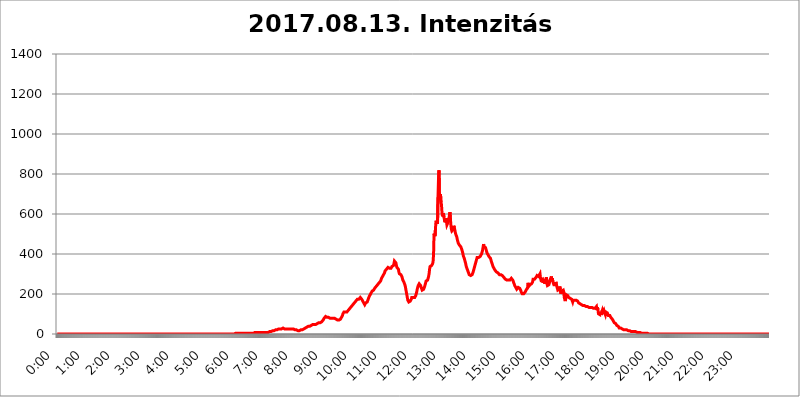
| Category | 2017.08.13. Intenzitás [W/m^2] |
|---|---|
| 0.0 | 0 |
| 0.0006944444444444445 | 0 |
| 0.001388888888888889 | 0 |
| 0.0020833333333333333 | 0 |
| 0.002777777777777778 | 0 |
| 0.003472222222222222 | 0 |
| 0.004166666666666667 | 0 |
| 0.004861111111111111 | 0 |
| 0.005555555555555556 | 0 |
| 0.0062499999999999995 | 0 |
| 0.006944444444444444 | 0 |
| 0.007638888888888889 | 0 |
| 0.008333333333333333 | 0 |
| 0.009027777777777779 | 0 |
| 0.009722222222222222 | 0 |
| 0.010416666666666666 | 0 |
| 0.011111111111111112 | 0 |
| 0.011805555555555555 | 0 |
| 0.012499999999999999 | 0 |
| 0.013194444444444444 | 0 |
| 0.013888888888888888 | 0 |
| 0.014583333333333332 | 0 |
| 0.015277777777777777 | 0 |
| 0.015972222222222224 | 0 |
| 0.016666666666666666 | 0 |
| 0.017361111111111112 | 0 |
| 0.018055555555555557 | 0 |
| 0.01875 | 0 |
| 0.019444444444444445 | 0 |
| 0.02013888888888889 | 0 |
| 0.020833333333333332 | 0 |
| 0.02152777777777778 | 0 |
| 0.022222222222222223 | 0 |
| 0.02291666666666667 | 0 |
| 0.02361111111111111 | 0 |
| 0.024305555555555556 | 0 |
| 0.024999999999999998 | 0 |
| 0.025694444444444447 | 0 |
| 0.02638888888888889 | 0 |
| 0.027083333333333334 | 0 |
| 0.027777777777777776 | 0 |
| 0.02847222222222222 | 0 |
| 0.029166666666666664 | 0 |
| 0.029861111111111113 | 0 |
| 0.030555555555555555 | 0 |
| 0.03125 | 0 |
| 0.03194444444444445 | 0 |
| 0.03263888888888889 | 0 |
| 0.03333333333333333 | 0 |
| 0.034027777777777775 | 0 |
| 0.034722222222222224 | 0 |
| 0.035416666666666666 | 0 |
| 0.036111111111111115 | 0 |
| 0.03680555555555556 | 0 |
| 0.0375 | 0 |
| 0.03819444444444444 | 0 |
| 0.03888888888888889 | 0 |
| 0.03958333333333333 | 0 |
| 0.04027777777777778 | 0 |
| 0.04097222222222222 | 0 |
| 0.041666666666666664 | 0 |
| 0.042361111111111106 | 0 |
| 0.04305555555555556 | 0 |
| 0.043750000000000004 | 0 |
| 0.044444444444444446 | 0 |
| 0.04513888888888889 | 0 |
| 0.04583333333333334 | 0 |
| 0.04652777777777778 | 0 |
| 0.04722222222222222 | 0 |
| 0.04791666666666666 | 0 |
| 0.04861111111111111 | 0 |
| 0.049305555555555554 | 0 |
| 0.049999999999999996 | 0 |
| 0.05069444444444445 | 0 |
| 0.051388888888888894 | 0 |
| 0.052083333333333336 | 0 |
| 0.05277777777777778 | 0 |
| 0.05347222222222222 | 0 |
| 0.05416666666666667 | 0 |
| 0.05486111111111111 | 0 |
| 0.05555555555555555 | 0 |
| 0.05625 | 0 |
| 0.05694444444444444 | 0 |
| 0.057638888888888885 | 0 |
| 0.05833333333333333 | 0 |
| 0.05902777777777778 | 0 |
| 0.059722222222222225 | 0 |
| 0.06041666666666667 | 0 |
| 0.061111111111111116 | 0 |
| 0.06180555555555556 | 0 |
| 0.0625 | 0 |
| 0.06319444444444444 | 0 |
| 0.06388888888888888 | 0 |
| 0.06458333333333334 | 0 |
| 0.06527777777777778 | 0 |
| 0.06597222222222222 | 0 |
| 0.06666666666666667 | 0 |
| 0.06736111111111111 | 0 |
| 0.06805555555555555 | 0 |
| 0.06874999999999999 | 0 |
| 0.06944444444444443 | 0 |
| 0.07013888888888889 | 0 |
| 0.07083333333333333 | 0 |
| 0.07152777777777779 | 0 |
| 0.07222222222222223 | 0 |
| 0.07291666666666667 | 0 |
| 0.07361111111111111 | 0 |
| 0.07430555555555556 | 0 |
| 0.075 | 0 |
| 0.07569444444444444 | 0 |
| 0.0763888888888889 | 0 |
| 0.07708333333333334 | 0 |
| 0.07777777777777778 | 0 |
| 0.07847222222222222 | 0 |
| 0.07916666666666666 | 0 |
| 0.0798611111111111 | 0 |
| 0.08055555555555556 | 0 |
| 0.08125 | 0 |
| 0.08194444444444444 | 0 |
| 0.08263888888888889 | 0 |
| 0.08333333333333333 | 0 |
| 0.08402777777777777 | 0 |
| 0.08472222222222221 | 0 |
| 0.08541666666666665 | 0 |
| 0.08611111111111112 | 0 |
| 0.08680555555555557 | 0 |
| 0.08750000000000001 | 0 |
| 0.08819444444444445 | 0 |
| 0.08888888888888889 | 0 |
| 0.08958333333333333 | 0 |
| 0.09027777777777778 | 0 |
| 0.09097222222222222 | 0 |
| 0.09166666666666667 | 0 |
| 0.09236111111111112 | 0 |
| 0.09305555555555556 | 0 |
| 0.09375 | 0 |
| 0.09444444444444444 | 0 |
| 0.09513888888888888 | 0 |
| 0.09583333333333333 | 0 |
| 0.09652777777777777 | 0 |
| 0.09722222222222222 | 0 |
| 0.09791666666666667 | 0 |
| 0.09861111111111111 | 0 |
| 0.09930555555555555 | 0 |
| 0.09999999999999999 | 0 |
| 0.10069444444444443 | 0 |
| 0.1013888888888889 | 0 |
| 0.10208333333333335 | 0 |
| 0.10277777777777779 | 0 |
| 0.10347222222222223 | 0 |
| 0.10416666666666667 | 0 |
| 0.10486111111111111 | 0 |
| 0.10555555555555556 | 0 |
| 0.10625 | 0 |
| 0.10694444444444444 | 0 |
| 0.1076388888888889 | 0 |
| 0.10833333333333334 | 0 |
| 0.10902777777777778 | 0 |
| 0.10972222222222222 | 0 |
| 0.1111111111111111 | 0 |
| 0.11180555555555556 | 0 |
| 0.11180555555555556 | 0 |
| 0.1125 | 0 |
| 0.11319444444444444 | 0 |
| 0.11388888888888889 | 0 |
| 0.11458333333333333 | 0 |
| 0.11527777777777777 | 0 |
| 0.11597222222222221 | 0 |
| 0.11666666666666665 | 0 |
| 0.1173611111111111 | 0 |
| 0.11805555555555557 | 0 |
| 0.11944444444444445 | 0 |
| 0.12013888888888889 | 0 |
| 0.12083333333333333 | 0 |
| 0.12152777777777778 | 0 |
| 0.12222222222222223 | 0 |
| 0.12291666666666667 | 0 |
| 0.12291666666666667 | 0 |
| 0.12361111111111112 | 0 |
| 0.12430555555555556 | 0 |
| 0.125 | 0 |
| 0.12569444444444444 | 0 |
| 0.12638888888888888 | 0 |
| 0.12708333333333333 | 0 |
| 0.16875 | 0 |
| 0.12847222222222224 | 0 |
| 0.12916666666666668 | 0 |
| 0.12986111111111112 | 0 |
| 0.13055555555555556 | 0 |
| 0.13125 | 0 |
| 0.13194444444444445 | 0 |
| 0.1326388888888889 | 0 |
| 0.13333333333333333 | 0 |
| 0.13402777777777777 | 0 |
| 0.13402777777777777 | 0 |
| 0.13472222222222222 | 0 |
| 0.13541666666666666 | 0 |
| 0.1361111111111111 | 0 |
| 0.13749999999999998 | 0 |
| 0.13819444444444443 | 0 |
| 0.1388888888888889 | 0 |
| 0.13958333333333334 | 0 |
| 0.14027777777777778 | 0 |
| 0.14097222222222222 | 0 |
| 0.14166666666666666 | 0 |
| 0.1423611111111111 | 0 |
| 0.14305555555555557 | 0 |
| 0.14375000000000002 | 0 |
| 0.14444444444444446 | 0 |
| 0.1451388888888889 | 0 |
| 0.1451388888888889 | 0 |
| 0.14652777777777778 | 0 |
| 0.14722222222222223 | 0 |
| 0.14791666666666667 | 0 |
| 0.1486111111111111 | 0 |
| 0.14930555555555555 | 0 |
| 0.15 | 0 |
| 0.15069444444444444 | 0 |
| 0.15138888888888888 | 0 |
| 0.15208333333333332 | 0 |
| 0.15277777777777776 | 0 |
| 0.15347222222222223 | 0 |
| 0.15416666666666667 | 0 |
| 0.15486111111111112 | 0 |
| 0.15555555555555556 | 0 |
| 0.15625 | 0 |
| 0.15694444444444444 | 0 |
| 0.15763888888888888 | 0 |
| 0.15833333333333333 | 0 |
| 0.15902777777777777 | 0 |
| 0.15972222222222224 | 0 |
| 0.16041666666666668 | 0 |
| 0.16111111111111112 | 0 |
| 0.16180555555555556 | 0 |
| 0.1625 | 0 |
| 0.16319444444444445 | 0 |
| 0.1638888888888889 | 0 |
| 0.16458333333333333 | 0 |
| 0.16527777777777777 | 0 |
| 0.16597222222222222 | 0 |
| 0.16666666666666666 | 0 |
| 0.1673611111111111 | 0 |
| 0.16805555555555554 | 0 |
| 0.16874999999999998 | 0 |
| 0.16944444444444443 | 0 |
| 0.17013888888888887 | 0 |
| 0.1708333333333333 | 0 |
| 0.17152777777777775 | 0 |
| 0.17222222222222225 | 0 |
| 0.1729166666666667 | 0 |
| 0.17361111111111113 | 0 |
| 0.17430555555555557 | 0 |
| 0.17500000000000002 | 0 |
| 0.17569444444444446 | 0 |
| 0.1763888888888889 | 0 |
| 0.17708333333333334 | 0 |
| 0.17777777777777778 | 0 |
| 0.17847222222222223 | 0 |
| 0.17916666666666667 | 0 |
| 0.1798611111111111 | 0 |
| 0.18055555555555555 | 0 |
| 0.18125 | 0 |
| 0.18194444444444444 | 0 |
| 0.1826388888888889 | 0 |
| 0.18333333333333335 | 0 |
| 0.1840277777777778 | 0 |
| 0.18472222222222223 | 0 |
| 0.18541666666666667 | 0 |
| 0.18611111111111112 | 0 |
| 0.18680555555555556 | 0 |
| 0.1875 | 0 |
| 0.18819444444444444 | 0 |
| 0.18888888888888888 | 0 |
| 0.18958333333333333 | 0 |
| 0.19027777777777777 | 0 |
| 0.1909722222222222 | 0 |
| 0.19166666666666665 | 0 |
| 0.19236111111111112 | 0 |
| 0.19305555555555554 | 0 |
| 0.19375 | 0 |
| 0.19444444444444445 | 0 |
| 0.1951388888888889 | 0 |
| 0.19583333333333333 | 0 |
| 0.19652777777777777 | 0 |
| 0.19722222222222222 | 0 |
| 0.19791666666666666 | 0 |
| 0.1986111111111111 | 0 |
| 0.19930555555555554 | 0 |
| 0.19999999999999998 | 0 |
| 0.20069444444444443 | 0 |
| 0.20138888888888887 | 0 |
| 0.2020833333333333 | 0 |
| 0.2027777777777778 | 0 |
| 0.2034722222222222 | 0 |
| 0.2041666666666667 | 0 |
| 0.20486111111111113 | 0 |
| 0.20555555555555557 | 0 |
| 0.20625000000000002 | 0 |
| 0.20694444444444446 | 0 |
| 0.2076388888888889 | 0 |
| 0.20833333333333334 | 0 |
| 0.20902777777777778 | 0 |
| 0.20972222222222223 | 0 |
| 0.21041666666666667 | 0 |
| 0.2111111111111111 | 0 |
| 0.21180555555555555 | 0 |
| 0.2125 | 0 |
| 0.21319444444444444 | 0 |
| 0.2138888888888889 | 0 |
| 0.21458333333333335 | 0 |
| 0.2152777777777778 | 0 |
| 0.21597222222222223 | 0 |
| 0.21666666666666667 | 0 |
| 0.21736111111111112 | 0 |
| 0.21805555555555556 | 0 |
| 0.21875 | 0 |
| 0.21944444444444444 | 0 |
| 0.22013888888888888 | 0 |
| 0.22083333333333333 | 0 |
| 0.22152777777777777 | 0 |
| 0.2222222222222222 | 0 |
| 0.22291666666666665 | 0 |
| 0.2236111111111111 | 0 |
| 0.22430555555555556 | 0 |
| 0.225 | 0 |
| 0.22569444444444445 | 0 |
| 0.2263888888888889 | 0 |
| 0.22708333333333333 | 0 |
| 0.22777777777777777 | 0 |
| 0.22847222222222222 | 0 |
| 0.22916666666666666 | 0 |
| 0.2298611111111111 | 0 |
| 0.23055555555555554 | 0 |
| 0.23124999999999998 | 0 |
| 0.23194444444444443 | 0 |
| 0.23263888888888887 | 0 |
| 0.2333333333333333 | 0 |
| 0.2340277777777778 | 0 |
| 0.2347222222222222 | 0 |
| 0.2354166666666667 | 0 |
| 0.23611111111111113 | 0 |
| 0.23680555555555557 | 0 |
| 0.23750000000000002 | 0 |
| 0.23819444444444446 | 0 |
| 0.2388888888888889 | 0 |
| 0.23958333333333334 | 0 |
| 0.24027777777777778 | 0 |
| 0.24097222222222223 | 0 |
| 0.24166666666666667 | 0 |
| 0.2423611111111111 | 0 |
| 0.24305555555555555 | 0 |
| 0.24375 | 0 |
| 0.24444444444444446 | 0 |
| 0.24513888888888888 | 0 |
| 0.24583333333333335 | 0 |
| 0.2465277777777778 | 0 |
| 0.24722222222222223 | 0 |
| 0.24791666666666667 | 0 |
| 0.24861111111111112 | 0 |
| 0.24930555555555556 | 0 |
| 0.25 | 3.525 |
| 0.25069444444444444 | 3.525 |
| 0.2513888888888889 | 3.525 |
| 0.2520833333333333 | 3.525 |
| 0.25277777777777777 | 3.525 |
| 0.2534722222222222 | 3.525 |
| 0.25416666666666665 | 3.525 |
| 0.2548611111111111 | 3.525 |
| 0.2555555555555556 | 3.525 |
| 0.25625000000000003 | 3.525 |
| 0.2569444444444445 | 3.525 |
| 0.2576388888888889 | 3.525 |
| 0.25833333333333336 | 3.525 |
| 0.2590277777777778 | 3.525 |
| 0.25972222222222224 | 3.525 |
| 0.2604166666666667 | 3.525 |
| 0.2611111111111111 | 3.525 |
| 0.26180555555555557 | 3.525 |
| 0.2625 | 3.525 |
| 0.26319444444444445 | 3.525 |
| 0.2638888888888889 | 3.525 |
| 0.26458333333333334 | 3.525 |
| 0.2652777777777778 | 3.525 |
| 0.2659722222222222 | 3.525 |
| 0.26666666666666666 | 3.525 |
| 0.2673611111111111 | 3.525 |
| 0.26805555555555555 | 3.525 |
| 0.26875 | 3.525 |
| 0.26944444444444443 | 3.525 |
| 0.2701388888888889 | 3.525 |
| 0.2708333333333333 | 3.525 |
| 0.27152777777777776 | 3.525 |
| 0.2722222222222222 | 3.525 |
| 0.27291666666666664 | 3.525 |
| 0.2736111111111111 | 3.525 |
| 0.2743055555555555 | 3.525 |
| 0.27499999999999997 | 3.525 |
| 0.27569444444444446 | 7.887 |
| 0.27638888888888885 | 7.887 |
| 0.27708333333333335 | 7.887 |
| 0.2777777777777778 | 7.887 |
| 0.27847222222222223 | 7.887 |
| 0.2791666666666667 | 7.887 |
| 0.2798611111111111 | 12.257 |
| 0.28055555555555556 | 12.257 |
| 0.28125 | 7.887 |
| 0.28194444444444444 | 7.887 |
| 0.2826388888888889 | 7.887 |
| 0.2833333333333333 | 7.887 |
| 0.28402777777777777 | 7.887 |
| 0.2847222222222222 | 7.887 |
| 0.28541666666666665 | 7.887 |
| 0.28611111111111115 | 7.887 |
| 0.28680555555555554 | 7.887 |
| 0.28750000000000003 | 7.887 |
| 0.2881944444444445 | 7.887 |
| 0.2888888888888889 | 7.887 |
| 0.28958333333333336 | 7.887 |
| 0.2902777777777778 | 7.887 |
| 0.29097222222222224 | 7.887 |
| 0.2916666666666667 | 7.887 |
| 0.2923611111111111 | 7.887 |
| 0.29305555555555557 | 7.887 |
| 0.29375 | 7.887 |
| 0.29444444444444445 | 7.887 |
| 0.2951388888888889 | 7.887 |
| 0.29583333333333334 | 7.887 |
| 0.2965277777777778 | 12.257 |
| 0.2972222222222222 | 12.257 |
| 0.29791666666666666 | 12.257 |
| 0.2986111111111111 | 12.257 |
| 0.29930555555555555 | 12.257 |
| 0.3 | 12.257 |
| 0.30069444444444443 | 12.257 |
| 0.3013888888888889 | 12.257 |
| 0.3020833333333333 | 16.636 |
| 0.30277777777777776 | 16.636 |
| 0.3034722222222222 | 16.636 |
| 0.30416666666666664 | 16.636 |
| 0.3048611111111111 | 16.636 |
| 0.3055555555555555 | 16.636 |
| 0.30624999999999997 | 21.024 |
| 0.3069444444444444 | 21.024 |
| 0.3076388888888889 | 21.024 |
| 0.30833333333333335 | 21.024 |
| 0.3090277777777778 | 25.419 |
| 0.30972222222222223 | 25.419 |
| 0.3104166666666667 | 25.419 |
| 0.3111111111111111 | 25.419 |
| 0.31180555555555556 | 25.419 |
| 0.3125 | 25.419 |
| 0.31319444444444444 | 25.419 |
| 0.3138888888888889 | 25.419 |
| 0.3145833333333333 | 25.419 |
| 0.31527777777777777 | 25.419 |
| 0.3159722222222222 | 25.419 |
| 0.31666666666666665 | 29.823 |
| 0.31736111111111115 | 29.823 |
| 0.31805555555555554 | 29.823 |
| 0.31875000000000003 | 25.419 |
| 0.3194444444444445 | 25.419 |
| 0.3201388888888889 | 25.419 |
| 0.32083333333333336 | 25.419 |
| 0.3215277777777778 | 25.419 |
| 0.32222222222222224 | 25.419 |
| 0.3229166666666667 | 25.419 |
| 0.3236111111111111 | 25.419 |
| 0.32430555555555557 | 25.419 |
| 0.325 | 25.419 |
| 0.32569444444444445 | 25.419 |
| 0.3263888888888889 | 25.419 |
| 0.32708333333333334 | 25.419 |
| 0.3277777777777778 | 25.419 |
| 0.3284722222222222 | 25.419 |
| 0.32916666666666666 | 25.419 |
| 0.3298611111111111 | 25.419 |
| 0.33055555555555555 | 25.419 |
| 0.33125 | 25.419 |
| 0.33194444444444443 | 25.419 |
| 0.3326388888888889 | 21.024 |
| 0.3333333333333333 | 21.024 |
| 0.3340277777777778 | 21.024 |
| 0.3347222222222222 | 21.024 |
| 0.3354166666666667 | 21.024 |
| 0.3361111111111111 | 21.024 |
| 0.3368055555555556 | 21.024 |
| 0.33749999999999997 | 16.636 |
| 0.33819444444444446 | 16.636 |
| 0.33888888888888885 | 16.636 |
| 0.33958333333333335 | 16.636 |
| 0.34027777777777773 | 21.024 |
| 0.34097222222222223 | 21.024 |
| 0.3416666666666666 | 21.024 |
| 0.3423611111111111 | 21.024 |
| 0.3430555555555555 | 21.024 |
| 0.34375 | 21.024 |
| 0.3444444444444445 | 25.419 |
| 0.3451388888888889 | 25.419 |
| 0.3458333333333334 | 25.419 |
| 0.34652777777777777 | 29.823 |
| 0.34722222222222227 | 29.823 |
| 0.34791666666666665 | 29.823 |
| 0.34861111111111115 | 34.234 |
| 0.34930555555555554 | 34.234 |
| 0.35000000000000003 | 34.234 |
| 0.3506944444444444 | 34.234 |
| 0.3513888888888889 | 34.234 |
| 0.3520833333333333 | 38.653 |
| 0.3527777777777778 | 38.653 |
| 0.3534722222222222 | 38.653 |
| 0.3541666666666667 | 38.653 |
| 0.3548611111111111 | 38.653 |
| 0.35555555555555557 | 43.079 |
| 0.35625 | 43.079 |
| 0.35694444444444445 | 47.511 |
| 0.3576388888888889 | 47.511 |
| 0.35833333333333334 | 47.511 |
| 0.3590277777777778 | 47.511 |
| 0.3597222222222222 | 47.511 |
| 0.36041666666666666 | 47.511 |
| 0.3611111111111111 | 47.511 |
| 0.36180555555555555 | 47.511 |
| 0.3625 | 47.511 |
| 0.36319444444444443 | 51.951 |
| 0.3638888888888889 | 51.951 |
| 0.3645833333333333 | 51.951 |
| 0.3652777777777778 | 51.951 |
| 0.3659722222222222 | 51.951 |
| 0.3666666666666667 | 56.398 |
| 0.3673611111111111 | 56.398 |
| 0.3680555555555556 | 56.398 |
| 0.36874999999999997 | 56.398 |
| 0.36944444444444446 | 56.398 |
| 0.37013888888888885 | 56.398 |
| 0.37083333333333335 | 60.85 |
| 0.37152777777777773 | 60.85 |
| 0.37222222222222223 | 65.31 |
| 0.3729166666666666 | 69.775 |
| 0.3736111111111111 | 74.246 |
| 0.3743055555555555 | 78.722 |
| 0.375 | 83.205 |
| 0.3756944444444445 | 83.205 |
| 0.3763888888888889 | 87.692 |
| 0.3770833333333334 | 87.692 |
| 0.37777777777777777 | 83.205 |
| 0.37847222222222227 | 83.205 |
| 0.37916666666666665 | 83.205 |
| 0.37986111111111115 | 83.205 |
| 0.38055555555555554 | 83.205 |
| 0.38125000000000003 | 83.205 |
| 0.3819444444444444 | 78.722 |
| 0.3826388888888889 | 78.722 |
| 0.3833333333333333 | 78.722 |
| 0.3840277777777778 | 78.722 |
| 0.3847222222222222 | 78.722 |
| 0.3854166666666667 | 78.722 |
| 0.3861111111111111 | 78.722 |
| 0.38680555555555557 | 78.722 |
| 0.3875 | 78.722 |
| 0.38819444444444445 | 78.722 |
| 0.3888888888888889 | 78.722 |
| 0.38958333333333334 | 78.722 |
| 0.3902777777777778 | 78.722 |
| 0.3909722222222222 | 74.246 |
| 0.39166666666666666 | 74.246 |
| 0.3923611111111111 | 74.246 |
| 0.39305555555555555 | 69.775 |
| 0.39375 | 69.775 |
| 0.39444444444444443 | 69.775 |
| 0.3951388888888889 | 69.775 |
| 0.3958333333333333 | 69.775 |
| 0.3965277777777778 | 74.246 |
| 0.3972222222222222 | 74.246 |
| 0.3979166666666667 | 78.722 |
| 0.3986111111111111 | 83.205 |
| 0.3993055555555556 | 87.692 |
| 0.39999999999999997 | 92.184 |
| 0.40069444444444446 | 101.184 |
| 0.40138888888888885 | 101.184 |
| 0.40208333333333335 | 110.201 |
| 0.40277777777777773 | 110.201 |
| 0.40347222222222223 | 110.201 |
| 0.4041666666666666 | 110.201 |
| 0.4048611111111111 | 110.201 |
| 0.4055555555555555 | 110.201 |
| 0.40625 | 110.201 |
| 0.4069444444444445 | 110.201 |
| 0.4076388888888889 | 114.716 |
| 0.4083333333333334 | 119.235 |
| 0.40902777777777777 | 119.235 |
| 0.40972222222222227 | 123.758 |
| 0.41041666666666665 | 128.284 |
| 0.41111111111111115 | 132.814 |
| 0.41180555555555554 | 132.814 |
| 0.41250000000000003 | 137.347 |
| 0.4131944444444444 | 141.884 |
| 0.4138888888888889 | 141.884 |
| 0.4145833333333333 | 146.423 |
| 0.4152777777777778 | 150.964 |
| 0.4159722222222222 | 150.964 |
| 0.4166666666666667 | 155.509 |
| 0.4173611111111111 | 155.509 |
| 0.41805555555555557 | 160.056 |
| 0.41875 | 164.605 |
| 0.41944444444444445 | 164.605 |
| 0.4201388888888889 | 169.156 |
| 0.42083333333333334 | 173.709 |
| 0.4215277777777778 | 173.709 |
| 0.4222222222222222 | 173.709 |
| 0.42291666666666666 | 173.709 |
| 0.4236111111111111 | 178.264 |
| 0.42430555555555555 | 178.264 |
| 0.425 | 182.82 |
| 0.42569444444444443 | 182.82 |
| 0.4263888888888889 | 178.264 |
| 0.4270833333333333 | 173.709 |
| 0.4277777777777778 | 169.156 |
| 0.4284722222222222 | 164.605 |
| 0.4291666666666667 | 160.056 |
| 0.4298611111111111 | 155.509 |
| 0.4305555555555556 | 150.964 |
| 0.43124999999999997 | 146.423 |
| 0.43194444444444446 | 150.964 |
| 0.43263888888888885 | 155.509 |
| 0.43333333333333335 | 155.509 |
| 0.43402777777777773 | 160.056 |
| 0.43472222222222223 | 160.056 |
| 0.4354166666666666 | 164.605 |
| 0.4361111111111111 | 173.709 |
| 0.4368055555555555 | 178.264 |
| 0.4375 | 187.378 |
| 0.4381944444444445 | 191.937 |
| 0.4388888888888889 | 196.497 |
| 0.4395833333333334 | 201.058 |
| 0.44027777777777777 | 205.62 |
| 0.44097222222222227 | 210.182 |
| 0.44166666666666665 | 214.746 |
| 0.44236111111111115 | 214.746 |
| 0.44305555555555554 | 219.309 |
| 0.44375000000000003 | 219.309 |
| 0.4444444444444444 | 223.873 |
| 0.4451388888888889 | 228.436 |
| 0.4458333333333333 | 233 |
| 0.4465277777777778 | 233 |
| 0.4472222222222222 | 237.564 |
| 0.4479166666666667 | 242.127 |
| 0.4486111111111111 | 242.127 |
| 0.44930555555555557 | 246.689 |
| 0.45 | 251.251 |
| 0.45069444444444445 | 251.251 |
| 0.4513888888888889 | 255.813 |
| 0.45208333333333334 | 255.813 |
| 0.4527777777777778 | 260.373 |
| 0.4534722222222222 | 264.932 |
| 0.45416666666666666 | 269.49 |
| 0.4548611111111111 | 278.603 |
| 0.45555555555555555 | 283.156 |
| 0.45625 | 287.709 |
| 0.45694444444444443 | 292.259 |
| 0.4576388888888889 | 296.808 |
| 0.4583333333333333 | 301.354 |
| 0.4590277777777778 | 305.898 |
| 0.4597222222222222 | 314.98 |
| 0.4604166666666667 | 314.98 |
| 0.4611111111111111 | 319.517 |
| 0.4618055555555556 | 324.052 |
| 0.46249999999999997 | 328.584 |
| 0.46319444444444446 | 328.584 |
| 0.46388888888888885 | 333.113 |
| 0.46458333333333335 | 333.113 |
| 0.46527777777777773 | 333.113 |
| 0.46597222222222223 | 328.584 |
| 0.4666666666666666 | 328.584 |
| 0.4673611111111111 | 328.584 |
| 0.4680555555555555 | 328.584 |
| 0.46875 | 328.584 |
| 0.4694444444444445 | 337.639 |
| 0.4701388888888889 | 337.639 |
| 0.4708333333333334 | 337.639 |
| 0.47152777777777777 | 342.162 |
| 0.47222222222222227 | 351.198 |
| 0.47291666666666665 | 364.728 |
| 0.47361111111111115 | 369.23 |
| 0.47430555555555554 | 360.221 |
| 0.47500000000000003 | 355.712 |
| 0.4756944444444444 | 342.162 |
| 0.4763888888888889 | 333.113 |
| 0.4770833333333333 | 333.113 |
| 0.4777777777777778 | 328.584 |
| 0.4784722222222222 | 324.052 |
| 0.4791666666666667 | 310.44 |
| 0.4798611111111111 | 301.354 |
| 0.48055555555555557 | 296.808 |
| 0.48125 | 296.808 |
| 0.48194444444444445 | 296.808 |
| 0.4826388888888889 | 292.259 |
| 0.48333333333333334 | 287.709 |
| 0.4840277777777778 | 278.603 |
| 0.4847222222222222 | 269.49 |
| 0.48541666666666666 | 269.49 |
| 0.4861111111111111 | 260.373 |
| 0.48680555555555555 | 255.813 |
| 0.4875 | 246.689 |
| 0.48819444444444443 | 237.564 |
| 0.4888888888888889 | 223.873 |
| 0.4895833333333333 | 210.182 |
| 0.4902777777777778 | 196.497 |
| 0.4909722222222222 | 182.82 |
| 0.4916666666666667 | 169.156 |
| 0.4923611111111111 | 164.605 |
| 0.4930555555555556 | 160.056 |
| 0.49374999999999997 | 160.056 |
| 0.49444444444444446 | 160.056 |
| 0.49513888888888885 | 164.605 |
| 0.49583333333333335 | 169.156 |
| 0.49652777777777773 | 173.709 |
| 0.49722222222222223 | 182.82 |
| 0.4979166666666666 | 182.82 |
| 0.4986111111111111 | 182.82 |
| 0.4993055555555555 | 182.82 |
| 0.5 | 182.82 |
| 0.5006944444444444 | 182.82 |
| 0.5013888888888889 | 182.82 |
| 0.5020833333333333 | 187.378 |
| 0.5027777777777778 | 191.937 |
| 0.5034722222222222 | 201.058 |
| 0.5041666666666667 | 210.182 |
| 0.5048611111111111 | 223.873 |
| 0.5055555555555555 | 233 |
| 0.50625 | 242.127 |
| 0.5069444444444444 | 246.689 |
| 0.5076388888888889 | 251.251 |
| 0.5083333333333333 | 251.251 |
| 0.5090277777777777 | 246.689 |
| 0.5097222222222222 | 242.127 |
| 0.5104166666666666 | 233 |
| 0.5111111111111112 | 228.436 |
| 0.5118055555555555 | 219.309 |
| 0.5125000000000001 | 219.309 |
| 0.5131944444444444 | 214.746 |
| 0.513888888888889 | 223.873 |
| 0.5145833333333333 | 228.436 |
| 0.5152777777777778 | 237.564 |
| 0.5159722222222222 | 246.689 |
| 0.5166666666666667 | 255.813 |
| 0.517361111111111 | 264.932 |
| 0.5180555555555556 | 269.49 |
| 0.5187499999999999 | 269.49 |
| 0.5194444444444445 | 269.49 |
| 0.5201388888888888 | 278.603 |
| 0.5208333333333334 | 287.709 |
| 0.5215277777777778 | 301.354 |
| 0.5222222222222223 | 324.052 |
| 0.5229166666666667 | 337.639 |
| 0.5236111111111111 | 342.162 |
| 0.5243055555555556 | 342.162 |
| 0.525 | 342.162 |
| 0.5256944444444445 | 342.162 |
| 0.5263888888888889 | 351.198 |
| 0.5270833333333333 | 360.221 |
| 0.5277777777777778 | 396.164 |
| 0.5284722222222222 | 502.192 |
| 0.5291666666666667 | 497.836 |
| 0.5298611111111111 | 489.108 |
| 0.5305555555555556 | 532.513 |
| 0.53125 | 566.793 |
| 0.5319444444444444 | 566.793 |
| 0.5326388888888889 | 566.793 |
| 0.5333333333333333 | 549.704 |
| 0.5340277777777778 | 683.473 |
| 0.5347222222222222 | 775.492 |
| 0.5354166666666667 | 818.392 |
| 0.5361111111111111 | 671.22 |
| 0.5368055555555555 | 667.123 |
| 0.5375 | 699.717 |
| 0.5381944444444444 | 658.909 |
| 0.5388888888888889 | 646.537 |
| 0.5395833333333333 | 609.062 |
| 0.5402777777777777 | 588.009 |
| 0.5409722222222222 | 596.45 |
| 0.5416666666666666 | 604.864 |
| 0.5423611111111112 | 583.779 |
| 0.5430555555555555 | 571.049 |
| 0.5437500000000001 | 558.261 |
| 0.5444444444444444 | 562.53 |
| 0.545138888888889 | 579.542 |
| 0.5458333333333333 | 562.53 |
| 0.5465277777777778 | 545.416 |
| 0.5472222222222222 | 541.121 |
| 0.5479166666666667 | 549.704 |
| 0.548611111111111 | 562.53 |
| 0.5493055555555556 | 558.261 |
| 0.5499999999999999 | 592.233 |
| 0.5506944444444445 | 609.062 |
| 0.5513888888888888 | 579.542 |
| 0.5520833333333334 | 545.416 |
| 0.5527777777777778 | 523.88 |
| 0.5534722222222223 | 515.223 |
| 0.5541666666666667 | 515.223 |
| 0.5548611111111111 | 515.223 |
| 0.5555555555555556 | 523.88 |
| 0.55625 | 541.121 |
| 0.5569444444444445 | 532.513 |
| 0.5576388888888889 | 519.555 |
| 0.5583333333333333 | 506.542 |
| 0.5590277777777778 | 497.836 |
| 0.5597222222222222 | 493.475 |
| 0.5604166666666667 | 484.735 |
| 0.5611111111111111 | 471.582 |
| 0.5618055555555556 | 462.786 |
| 0.5625 | 453.968 |
| 0.5631944444444444 | 449.551 |
| 0.5638888888888889 | 445.129 |
| 0.5645833333333333 | 440.702 |
| 0.5652777777777778 | 440.702 |
| 0.5659722222222222 | 436.27 |
| 0.5666666666666667 | 431.833 |
| 0.5673611111111111 | 422.943 |
| 0.5680555555555555 | 414.035 |
| 0.56875 | 405.108 |
| 0.5694444444444444 | 391.685 |
| 0.5701388888888889 | 387.202 |
| 0.5708333333333333 | 378.224 |
| 0.5715277777777777 | 369.23 |
| 0.5722222222222222 | 360.221 |
| 0.5729166666666666 | 351.198 |
| 0.5736111111111112 | 337.639 |
| 0.5743055555555555 | 333.113 |
| 0.5750000000000001 | 324.052 |
| 0.5756944444444444 | 319.517 |
| 0.576388888888889 | 310.44 |
| 0.5770833333333333 | 305.898 |
| 0.5777777777777778 | 296.808 |
| 0.5784722222222222 | 296.808 |
| 0.5791666666666667 | 292.259 |
| 0.579861111111111 | 292.259 |
| 0.5805555555555556 | 292.259 |
| 0.5812499999999999 | 292.259 |
| 0.5819444444444445 | 296.808 |
| 0.5826388888888888 | 301.354 |
| 0.5833333333333334 | 310.44 |
| 0.5840277777777778 | 319.517 |
| 0.5847222222222223 | 328.584 |
| 0.5854166666666667 | 337.639 |
| 0.5861111111111111 | 346.682 |
| 0.5868055555555556 | 355.712 |
| 0.5875 | 364.728 |
| 0.5881944444444445 | 369.23 |
| 0.5888888888888889 | 382.715 |
| 0.5895833333333333 | 387.202 |
| 0.5902777777777778 | 382.715 |
| 0.5909722222222222 | 382.715 |
| 0.5916666666666667 | 387.202 |
| 0.5923611111111111 | 387.202 |
| 0.5930555555555556 | 387.202 |
| 0.59375 | 387.202 |
| 0.5944444444444444 | 391.685 |
| 0.5951388888888889 | 400.638 |
| 0.5958333333333333 | 409.574 |
| 0.5965277777777778 | 418.492 |
| 0.5972222222222222 | 422.943 |
| 0.5979166666666667 | 449.551 |
| 0.5986111111111111 | 436.27 |
| 0.5993055555555555 | 436.27 |
| 0.6 | 436.27 |
| 0.6006944444444444 | 431.833 |
| 0.6013888888888889 | 422.943 |
| 0.6020833333333333 | 414.035 |
| 0.6027777777777777 | 405.108 |
| 0.6034722222222222 | 400.638 |
| 0.6041666666666666 | 396.164 |
| 0.6048611111111112 | 391.685 |
| 0.6055555555555555 | 387.202 |
| 0.6062500000000001 | 382.715 |
| 0.6069444444444444 | 382.715 |
| 0.607638888888889 | 378.224 |
| 0.6083333333333333 | 369.23 |
| 0.6090277777777778 | 360.221 |
| 0.6097222222222222 | 355.712 |
| 0.6104166666666667 | 346.682 |
| 0.611111111111111 | 337.639 |
| 0.6118055555555556 | 333.113 |
| 0.6124999999999999 | 328.584 |
| 0.6131944444444445 | 324.052 |
| 0.6138888888888888 | 319.517 |
| 0.6145833333333334 | 314.98 |
| 0.6152777777777778 | 314.98 |
| 0.6159722222222223 | 310.44 |
| 0.6166666666666667 | 305.898 |
| 0.6173611111111111 | 305.898 |
| 0.6180555555555556 | 305.898 |
| 0.61875 | 301.354 |
| 0.6194444444444445 | 301.354 |
| 0.6201388888888889 | 296.808 |
| 0.6208333333333333 | 296.808 |
| 0.6215277777777778 | 296.808 |
| 0.6222222222222222 | 296.808 |
| 0.6229166666666667 | 296.808 |
| 0.6236111111111111 | 292.259 |
| 0.6243055555555556 | 292.259 |
| 0.625 | 287.709 |
| 0.6256944444444444 | 287.709 |
| 0.6263888888888889 | 283.156 |
| 0.6270833333333333 | 278.603 |
| 0.6277777777777778 | 278.603 |
| 0.6284722222222222 | 274.047 |
| 0.6291666666666667 | 274.047 |
| 0.6298611111111111 | 274.047 |
| 0.6305555555555555 | 269.49 |
| 0.63125 | 269.49 |
| 0.6319444444444444 | 269.49 |
| 0.6326388888888889 | 269.49 |
| 0.6333333333333333 | 269.49 |
| 0.6340277777777777 | 269.49 |
| 0.6347222222222222 | 269.49 |
| 0.6354166666666666 | 274.047 |
| 0.6361111111111112 | 274.047 |
| 0.6368055555555555 | 278.603 |
| 0.6375000000000001 | 278.603 |
| 0.6381944444444444 | 274.047 |
| 0.638888888888889 | 269.49 |
| 0.6395833333333333 | 264.932 |
| 0.6402777777777778 | 255.813 |
| 0.6409722222222222 | 251.251 |
| 0.6416666666666667 | 242.127 |
| 0.642361111111111 | 237.564 |
| 0.6430555555555556 | 233 |
| 0.6437499999999999 | 228.436 |
| 0.6444444444444445 | 223.873 |
| 0.6451388888888888 | 223.873 |
| 0.6458333333333334 | 228.436 |
| 0.6465277777777778 | 233 |
| 0.6472222222222223 | 233 |
| 0.6479166666666667 | 233 |
| 0.6486111111111111 | 228.436 |
| 0.6493055555555556 | 223.873 |
| 0.65 | 219.309 |
| 0.6506944444444445 | 210.182 |
| 0.6513888888888889 | 205.62 |
| 0.6520833333333333 | 201.058 |
| 0.6527777777777778 | 201.058 |
| 0.6534722222222222 | 201.058 |
| 0.6541666666666667 | 201.058 |
| 0.6548611111111111 | 201.058 |
| 0.6555555555555556 | 205.62 |
| 0.65625 | 210.182 |
| 0.6569444444444444 | 210.182 |
| 0.6576388888888889 | 219.309 |
| 0.6583333333333333 | 219.309 |
| 0.6590277777777778 | 223.873 |
| 0.6597222222222222 | 233 |
| 0.6604166666666667 | 255.813 |
| 0.6611111111111111 | 237.564 |
| 0.6618055555555555 | 237.564 |
| 0.6625 | 242.127 |
| 0.6631944444444444 | 246.689 |
| 0.6638888888888889 | 251.251 |
| 0.6645833333333333 | 251.251 |
| 0.6652777777777777 | 251.251 |
| 0.6659722222222222 | 251.251 |
| 0.6666666666666666 | 260.373 |
| 0.6673611111111111 | 274.047 |
| 0.6680555555555556 | 278.603 |
| 0.6687500000000001 | 278.603 |
| 0.6694444444444444 | 274.047 |
| 0.6701388888888888 | 278.603 |
| 0.6708333333333334 | 278.603 |
| 0.6715277777777778 | 283.156 |
| 0.6722222222222222 | 287.709 |
| 0.6729166666666666 | 292.259 |
| 0.6736111111111112 | 287.709 |
| 0.6743055555555556 | 287.709 |
| 0.6749999999999999 | 287.709 |
| 0.6756944444444444 | 283.156 |
| 0.6763888888888889 | 292.259 |
| 0.6770833333333334 | 301.354 |
| 0.6777777777777777 | 278.603 |
| 0.6784722222222223 | 269.49 |
| 0.6791666666666667 | 269.49 |
| 0.6798611111111111 | 269.49 |
| 0.6805555555555555 | 274.047 |
| 0.68125 | 255.813 |
| 0.6819444444444445 | 260.373 |
| 0.6826388888888889 | 274.047 |
| 0.6833333333333332 | 269.49 |
| 0.6840277777777778 | 251.251 |
| 0.6847222222222222 | 255.813 |
| 0.6854166666666667 | 255.813 |
| 0.686111111111111 | 283.156 |
| 0.6868055555555556 | 251.251 |
| 0.6875 | 242.127 |
| 0.6881944444444444 | 242.127 |
| 0.688888888888889 | 242.127 |
| 0.6895833333333333 | 246.689 |
| 0.6902777777777778 | 255.813 |
| 0.6909722222222222 | 269.49 |
| 0.6916666666666668 | 274.047 |
| 0.6923611111111111 | 274.047 |
| 0.6930555555555555 | 287.709 |
| 0.69375 | 264.932 |
| 0.6944444444444445 | 278.603 |
| 0.6951388888888889 | 260.373 |
| 0.6958333333333333 | 264.932 |
| 0.6965277777777777 | 246.689 |
| 0.6972222222222223 | 242.127 |
| 0.6979166666666666 | 242.127 |
| 0.6986111111111111 | 246.689 |
| 0.6993055555555556 | 260.373 |
| 0.7000000000000001 | 251.251 |
| 0.7006944444444444 | 237.564 |
| 0.7013888888888888 | 233 |
| 0.7020833333333334 | 219.309 |
| 0.7027777777777778 | 214.746 |
| 0.7034722222222222 | 223.873 |
| 0.7041666666666666 | 223.873 |
| 0.7048611111111112 | 237.564 |
| 0.7055555555555556 | 223.873 |
| 0.7062499999999999 | 201.058 |
| 0.7069444444444444 | 201.058 |
| 0.7076388888888889 | 214.746 |
| 0.7083333333333334 | 219.309 |
| 0.7090277777777777 | 219.309 |
| 0.7097222222222223 | 219.309 |
| 0.7104166666666667 | 210.182 |
| 0.7111111111111111 | 182.82 |
| 0.7118055555555555 | 178.264 |
| 0.7125 | 164.605 |
| 0.7131944444444445 | 178.264 |
| 0.7138888888888889 | 196.497 |
| 0.7145833333333332 | 196.497 |
| 0.7152777777777778 | 191.937 |
| 0.7159722222222222 | 191.937 |
| 0.7166666666666667 | 187.378 |
| 0.717361111111111 | 182.82 |
| 0.7180555555555556 | 182.82 |
| 0.71875 | 182.82 |
| 0.7194444444444444 | 178.264 |
| 0.720138888888889 | 178.264 |
| 0.7208333333333333 | 178.264 |
| 0.7215277777777778 | 173.709 |
| 0.7222222222222222 | 169.156 |
| 0.7229166666666668 | 160.056 |
| 0.7236111111111111 | 169.156 |
| 0.7243055555555555 | 169.156 |
| 0.725 | 169.156 |
| 0.7256944444444445 | 169.156 |
| 0.7263888888888889 | 169.156 |
| 0.7270833333333333 | 169.156 |
| 0.7277777777777777 | 169.156 |
| 0.7284722222222223 | 169.156 |
| 0.7291666666666666 | 164.605 |
| 0.7298611111111111 | 164.605 |
| 0.7305555555555556 | 160.056 |
| 0.7312500000000001 | 155.509 |
| 0.7319444444444444 | 155.509 |
| 0.7326388888888888 | 155.509 |
| 0.7333333333333334 | 150.964 |
| 0.7340277777777778 | 146.423 |
| 0.7347222222222222 | 146.423 |
| 0.7354166666666666 | 146.423 |
| 0.7361111111111112 | 141.884 |
| 0.7368055555555556 | 141.884 |
| 0.7374999999999999 | 141.884 |
| 0.7381944444444444 | 141.884 |
| 0.7388888888888889 | 141.884 |
| 0.7395833333333334 | 141.884 |
| 0.7402777777777777 | 141.884 |
| 0.7409722222222223 | 141.884 |
| 0.7416666666666667 | 137.347 |
| 0.7423611111111111 | 137.347 |
| 0.7430555555555555 | 137.347 |
| 0.74375 | 137.347 |
| 0.7444444444444445 | 137.347 |
| 0.7451388888888889 | 137.347 |
| 0.7458333333333332 | 132.814 |
| 0.7465277777777778 | 132.814 |
| 0.7472222222222222 | 132.814 |
| 0.7479166666666667 | 132.814 |
| 0.748611111111111 | 132.814 |
| 0.7493055555555556 | 132.814 |
| 0.75 | 132.814 |
| 0.7506944444444444 | 132.814 |
| 0.751388888888889 | 128.284 |
| 0.7520833333333333 | 128.284 |
| 0.7527777777777778 | 128.284 |
| 0.7534722222222222 | 128.284 |
| 0.7541666666666668 | 128.284 |
| 0.7548611111111111 | 132.814 |
| 0.7555555555555555 | 132.814 |
| 0.75625 | 137.347 |
| 0.7569444444444445 | 119.235 |
| 0.7576388888888889 | 132.814 |
| 0.7583333333333333 | 123.758 |
| 0.7590277777777777 | 101.184 |
| 0.7597222222222223 | 101.184 |
| 0.7604166666666666 | 96.682 |
| 0.7611111111111111 | 96.682 |
| 0.7618055555555556 | 110.201 |
| 0.7625000000000001 | 96.682 |
| 0.7631944444444444 | 101.184 |
| 0.7638888888888888 | 101.184 |
| 0.7645833333333334 | 119.235 |
| 0.7652777777777778 | 110.201 |
| 0.7659722222222222 | 105.69 |
| 0.7666666666666666 | 119.235 |
| 0.7673611111111112 | 110.201 |
| 0.7680555555555556 | 105.69 |
| 0.7687499999999999 | 96.682 |
| 0.7694444444444444 | 110.201 |
| 0.7701388888888889 | 110.201 |
| 0.7708333333333334 | 105.69 |
| 0.7715277777777777 | 105.69 |
| 0.7722222222222223 | 105.69 |
| 0.7729166666666667 | 92.184 |
| 0.7736111111111111 | 96.682 |
| 0.7743055555555555 | 96.682 |
| 0.775 | 92.184 |
| 0.7756944444444445 | 87.692 |
| 0.7763888888888889 | 83.205 |
| 0.7770833333333332 | 83.205 |
| 0.7777777777777778 | 83.205 |
| 0.7784722222222222 | 74.246 |
| 0.7791666666666667 | 69.775 |
| 0.779861111111111 | 65.31 |
| 0.7805555555555556 | 60.85 |
| 0.78125 | 56.398 |
| 0.7819444444444444 | 56.398 |
| 0.782638888888889 | 60.85 |
| 0.7833333333333333 | 51.951 |
| 0.7840277777777778 | 47.511 |
| 0.7847222222222222 | 43.079 |
| 0.7854166666666668 | 38.653 |
| 0.7861111111111111 | 38.653 |
| 0.7868055555555555 | 38.653 |
| 0.7875 | 34.234 |
| 0.7881944444444445 | 29.823 |
| 0.7888888888888889 | 29.823 |
| 0.7895833333333333 | 29.823 |
| 0.7902777777777777 | 29.823 |
| 0.7909722222222223 | 29.823 |
| 0.7916666666666666 | 25.419 |
| 0.7923611111111111 | 25.419 |
| 0.7930555555555556 | 25.419 |
| 0.7937500000000001 | 21.024 |
| 0.7944444444444444 | 21.024 |
| 0.7951388888888888 | 21.024 |
| 0.7958333333333334 | 21.024 |
| 0.7965277777777778 | 21.024 |
| 0.7972222222222222 | 21.024 |
| 0.7979166666666666 | 21.024 |
| 0.7986111111111112 | 21.024 |
| 0.7993055555555556 | 21.024 |
| 0.7999999999999999 | 16.636 |
| 0.8006944444444444 | 16.636 |
| 0.8013888888888889 | 16.636 |
| 0.8020833333333334 | 16.636 |
| 0.8027777777777777 | 16.636 |
| 0.8034722222222223 | 16.636 |
| 0.8041666666666667 | 12.257 |
| 0.8048611111111111 | 12.257 |
| 0.8055555555555555 | 12.257 |
| 0.80625 | 12.257 |
| 0.8069444444444445 | 12.257 |
| 0.8076388888888889 | 12.257 |
| 0.8083333333333332 | 12.257 |
| 0.8090277777777778 | 12.257 |
| 0.8097222222222222 | 12.257 |
| 0.8104166666666667 | 12.257 |
| 0.811111111111111 | 12.257 |
| 0.8118055555555556 | 12.257 |
| 0.8125 | 12.257 |
| 0.8131944444444444 | 7.887 |
| 0.813888888888889 | 7.887 |
| 0.8145833333333333 | 7.887 |
| 0.8152777777777778 | 7.887 |
| 0.8159722222222222 | 7.887 |
| 0.8166666666666668 | 7.887 |
| 0.8173611111111111 | 7.887 |
| 0.8180555555555555 | 7.887 |
| 0.81875 | 7.887 |
| 0.8194444444444445 | 3.525 |
| 0.8201388888888889 | 3.525 |
| 0.8208333333333333 | 3.525 |
| 0.8215277777777777 | 3.525 |
| 0.8222222222222223 | 3.525 |
| 0.8229166666666666 | 3.525 |
| 0.8236111111111111 | 3.525 |
| 0.8243055555555556 | 3.525 |
| 0.8250000000000001 | 3.525 |
| 0.8256944444444444 | 3.525 |
| 0.8263888888888888 | 3.525 |
| 0.8270833333333334 | 3.525 |
| 0.8277777777777778 | 3.525 |
| 0.8284722222222222 | 0 |
| 0.8291666666666666 | 0 |
| 0.8298611111111112 | 0 |
| 0.8305555555555556 | 0 |
| 0.8312499999999999 | 0 |
| 0.8319444444444444 | 0 |
| 0.8326388888888889 | 0 |
| 0.8333333333333334 | 0 |
| 0.8340277777777777 | 0 |
| 0.8347222222222223 | 0 |
| 0.8354166666666667 | 0 |
| 0.8361111111111111 | 0 |
| 0.8368055555555555 | 0 |
| 0.8375 | 0 |
| 0.8381944444444445 | 0 |
| 0.8388888888888889 | 0 |
| 0.8395833333333332 | 0 |
| 0.8402777777777778 | 0 |
| 0.8409722222222222 | 0 |
| 0.8416666666666667 | 0 |
| 0.842361111111111 | 0 |
| 0.8430555555555556 | 0 |
| 0.84375 | 0 |
| 0.8444444444444444 | 0 |
| 0.845138888888889 | 0 |
| 0.8458333333333333 | 0 |
| 0.8465277777777778 | 0 |
| 0.8472222222222222 | 0 |
| 0.8479166666666668 | 0 |
| 0.8486111111111111 | 0 |
| 0.8493055555555555 | 0 |
| 0.85 | 0 |
| 0.8506944444444445 | 0 |
| 0.8513888888888889 | 0 |
| 0.8520833333333333 | 0 |
| 0.8527777777777777 | 0 |
| 0.8534722222222223 | 0 |
| 0.8541666666666666 | 0 |
| 0.8548611111111111 | 0 |
| 0.8555555555555556 | 0 |
| 0.8562500000000001 | 0 |
| 0.8569444444444444 | 0 |
| 0.8576388888888888 | 0 |
| 0.8583333333333334 | 0 |
| 0.8590277777777778 | 0 |
| 0.8597222222222222 | 0 |
| 0.8604166666666666 | 0 |
| 0.8611111111111112 | 0 |
| 0.8618055555555556 | 0 |
| 0.8624999999999999 | 0 |
| 0.8631944444444444 | 0 |
| 0.8638888888888889 | 0 |
| 0.8645833333333334 | 0 |
| 0.8652777777777777 | 0 |
| 0.8659722222222223 | 0 |
| 0.8666666666666667 | 0 |
| 0.8673611111111111 | 0 |
| 0.8680555555555555 | 0 |
| 0.86875 | 0 |
| 0.8694444444444445 | 0 |
| 0.8701388888888889 | 0 |
| 0.8708333333333332 | 0 |
| 0.8715277777777778 | 0 |
| 0.8722222222222222 | 0 |
| 0.8729166666666667 | 0 |
| 0.873611111111111 | 0 |
| 0.8743055555555556 | 0 |
| 0.875 | 0 |
| 0.8756944444444444 | 0 |
| 0.876388888888889 | 0 |
| 0.8770833333333333 | 0 |
| 0.8777777777777778 | 0 |
| 0.8784722222222222 | 0 |
| 0.8791666666666668 | 0 |
| 0.8798611111111111 | 0 |
| 0.8805555555555555 | 0 |
| 0.88125 | 0 |
| 0.8819444444444445 | 0 |
| 0.8826388888888889 | 0 |
| 0.8833333333333333 | 0 |
| 0.8840277777777777 | 0 |
| 0.8847222222222223 | 0 |
| 0.8854166666666666 | 0 |
| 0.8861111111111111 | 0 |
| 0.8868055555555556 | 0 |
| 0.8875000000000001 | 0 |
| 0.8881944444444444 | 0 |
| 0.8888888888888888 | 0 |
| 0.8895833333333334 | 0 |
| 0.8902777777777778 | 0 |
| 0.8909722222222222 | 0 |
| 0.8916666666666666 | 0 |
| 0.8923611111111112 | 0 |
| 0.8930555555555556 | 0 |
| 0.8937499999999999 | 0 |
| 0.8944444444444444 | 0 |
| 0.8951388888888889 | 0 |
| 0.8958333333333334 | 0 |
| 0.8965277777777777 | 0 |
| 0.8972222222222223 | 0 |
| 0.8979166666666667 | 0 |
| 0.8986111111111111 | 0 |
| 0.8993055555555555 | 0 |
| 0.9 | 0 |
| 0.9006944444444445 | 0 |
| 0.9013888888888889 | 0 |
| 0.9020833333333332 | 0 |
| 0.9027777777777778 | 0 |
| 0.9034722222222222 | 0 |
| 0.9041666666666667 | 0 |
| 0.904861111111111 | 0 |
| 0.9055555555555556 | 0 |
| 0.90625 | 0 |
| 0.9069444444444444 | 0 |
| 0.907638888888889 | 0 |
| 0.9083333333333333 | 0 |
| 0.9090277777777778 | 0 |
| 0.9097222222222222 | 0 |
| 0.9104166666666668 | 0 |
| 0.9111111111111111 | 0 |
| 0.9118055555555555 | 0 |
| 0.9125 | 0 |
| 0.9131944444444445 | 0 |
| 0.9138888888888889 | 0 |
| 0.9145833333333333 | 0 |
| 0.9152777777777777 | 0 |
| 0.9159722222222223 | 0 |
| 0.9166666666666666 | 0 |
| 0.9173611111111111 | 0 |
| 0.9180555555555556 | 0 |
| 0.9187500000000001 | 0 |
| 0.9194444444444444 | 0 |
| 0.9201388888888888 | 0 |
| 0.9208333333333334 | 0 |
| 0.9215277777777778 | 0 |
| 0.9222222222222222 | 0 |
| 0.9229166666666666 | 0 |
| 0.9236111111111112 | 0 |
| 0.9243055555555556 | 0 |
| 0.9249999999999999 | 0 |
| 0.9256944444444444 | 0 |
| 0.9263888888888889 | 0 |
| 0.9270833333333334 | 0 |
| 0.9277777777777777 | 0 |
| 0.9284722222222223 | 0 |
| 0.9291666666666667 | 0 |
| 0.9298611111111111 | 0 |
| 0.9305555555555555 | 0 |
| 0.93125 | 0 |
| 0.9319444444444445 | 0 |
| 0.9326388888888889 | 0 |
| 0.9333333333333332 | 0 |
| 0.9340277777777778 | 0 |
| 0.9347222222222222 | 0 |
| 0.9354166666666667 | 0 |
| 0.936111111111111 | 0 |
| 0.9368055555555556 | 0 |
| 0.9375 | 0 |
| 0.9381944444444444 | 0 |
| 0.938888888888889 | 0 |
| 0.9395833333333333 | 0 |
| 0.9402777777777778 | 0 |
| 0.9409722222222222 | 0 |
| 0.9416666666666668 | 0 |
| 0.9423611111111111 | 0 |
| 0.9430555555555555 | 0 |
| 0.94375 | 0 |
| 0.9444444444444445 | 0 |
| 0.9451388888888889 | 0 |
| 0.9458333333333333 | 0 |
| 0.9465277777777777 | 0 |
| 0.9472222222222223 | 0 |
| 0.9479166666666666 | 0 |
| 0.9486111111111111 | 0 |
| 0.9493055555555556 | 0 |
| 0.9500000000000001 | 0 |
| 0.9506944444444444 | 0 |
| 0.9513888888888888 | 0 |
| 0.9520833333333334 | 0 |
| 0.9527777777777778 | 0 |
| 0.9534722222222222 | 0 |
| 0.9541666666666666 | 0 |
| 0.9548611111111112 | 0 |
| 0.9555555555555556 | 0 |
| 0.9562499999999999 | 0 |
| 0.9569444444444444 | 0 |
| 0.9576388888888889 | 0 |
| 0.9583333333333334 | 0 |
| 0.9590277777777777 | 0 |
| 0.9597222222222223 | 0 |
| 0.9604166666666667 | 0 |
| 0.9611111111111111 | 0 |
| 0.9618055555555555 | 0 |
| 0.9625 | 0 |
| 0.9631944444444445 | 0 |
| 0.9638888888888889 | 0 |
| 0.9645833333333332 | 0 |
| 0.9652777777777778 | 0 |
| 0.9659722222222222 | 0 |
| 0.9666666666666667 | 0 |
| 0.967361111111111 | 0 |
| 0.9680555555555556 | 0 |
| 0.96875 | 0 |
| 0.9694444444444444 | 0 |
| 0.970138888888889 | 0 |
| 0.9708333333333333 | 0 |
| 0.9715277777777778 | 0 |
| 0.9722222222222222 | 0 |
| 0.9729166666666668 | 0 |
| 0.9736111111111111 | 0 |
| 0.9743055555555555 | 0 |
| 0.975 | 0 |
| 0.9756944444444445 | 0 |
| 0.9763888888888889 | 0 |
| 0.9770833333333333 | 0 |
| 0.9777777777777777 | 0 |
| 0.9784722222222223 | 0 |
| 0.9791666666666666 | 0 |
| 0.9798611111111111 | 0 |
| 0.9805555555555556 | 0 |
| 0.9812500000000001 | 0 |
| 0.9819444444444444 | 0 |
| 0.9826388888888888 | 0 |
| 0.9833333333333334 | 0 |
| 0.9840277777777778 | 0 |
| 0.9847222222222222 | 0 |
| 0.9854166666666666 | 0 |
| 0.9861111111111112 | 0 |
| 0.9868055555555556 | 0 |
| 0.9874999999999999 | 0 |
| 0.9881944444444444 | 0 |
| 0.9888888888888889 | 0 |
| 0.9895833333333334 | 0 |
| 0.9902777777777777 | 0 |
| 0.9909722222222223 | 0 |
| 0.9916666666666667 | 0 |
| 0.9923611111111111 | 0 |
| 0.9930555555555555 | 0 |
| 0.99375 | 0 |
| 0.9944444444444445 | 0 |
| 0.9951388888888889 | 0 |
| 0.9958333333333332 | 0 |
| 0.9965277777777778 | 0 |
| 0.9972222222222222 | 0 |
| 0.9979166666666667 | 0 |
| 0.998611111111111 | 0 |
| 0.9993055555555556 | 0 |